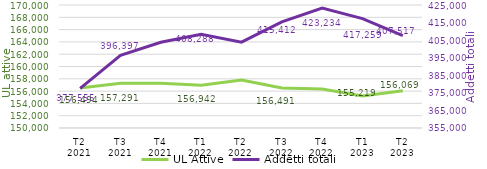
| Category | UL Attive |
|---|---|
| T2
2021 | 156494 |
| T3
2021 | 157291 |
| T4
2021 | 157277 |
| T1
2022 | 156942 |
| T2
2022 | 157813 |
| T3
2022 | 156491 |
| T4
2022 | 156347 |
| T1
2023 | 155219 |
| T2
2023 | 156069 |